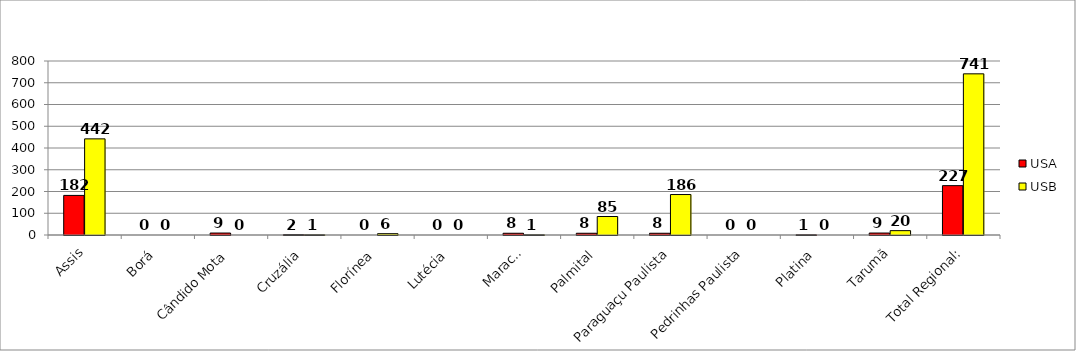
| Category | USA | USB |
|---|---|---|
| Assis | 182 | 442 |
| Borá | 0 | 0 |
| Cândido Mota | 9 | 0 |
| Cruzália | 2 | 1 |
| Florínea | 0 | 6 |
| Lutécia | 0 | 0 |
| Maracaí | 8 | 1 |
| Palmital | 8 | 85 |
| Paraguaçu Paulista | 8 | 186 |
| Pedrinhas Paulista | 0 | 0 |
| Platina | 1 | 0 |
| Tarumã | 9 | 20 |
| Total Regional: | 227 | 741 |